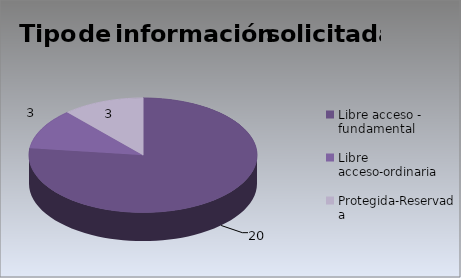
| Category | Series 0 |
|---|---|
| Libre acceso - fundamental | 20 |
| Libre acceso-ordinaria  | 3 |
| Protegida-Reservada | 3 |